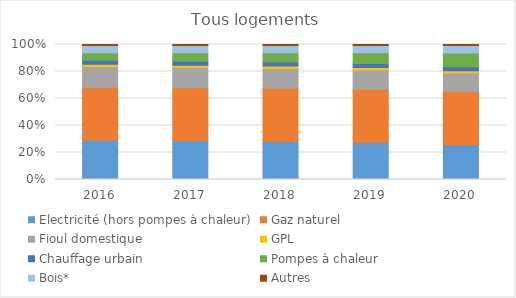
| Category | Electricité (hors pompes à chaleur) | Gaz naturel | Fioul domestique | GPL | Chauffage urbain | Pompes à chaleur | Bois* | Autres |
|---|---|---|---|---|---|---|---|---|
| 2016.0 | 0.291 | 0.392 | 0.153 | 0.018 | 0.029 | 0.057 | 0.053 | 0.007 |
| 2017.0 | 0.286 | 0.393 | 0.15 | 0.018 | 0.029 | 0.063 | 0.053 | 0.007 |
| 2018.0 | 0.282 | 0.394 | 0.147 | 0.018 | 0.029 | 0.069 | 0.053 | 0.008 |
| 2019.0 | 0.274 | 0.396 | 0.142 | 0.017 | 0.03 | 0.08 | 0.053 | 0.008 |
| 2020.0 | 0.256 | 0.397 | 0.136 | 0.017 | 0.031 | 0.102 | 0.055 | 0.008 |